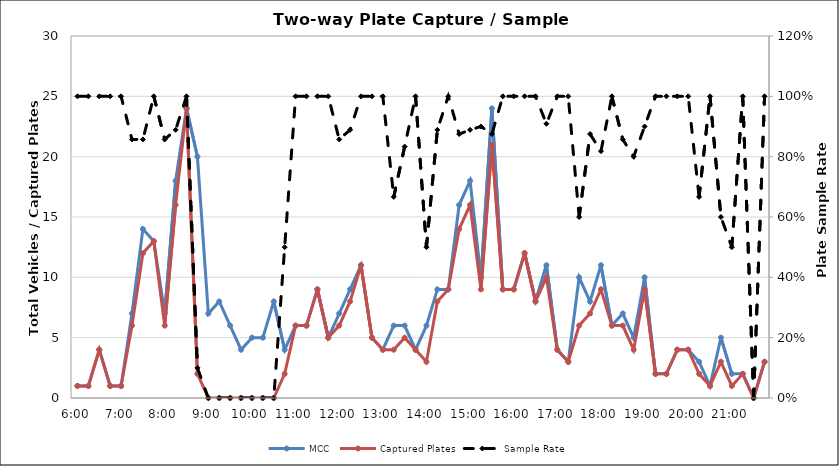
| Category | MCC | Captured Plates |
|---|---|---|
| 0.25 | 1 | 1 |
| 0.260416666666667 | 1 | 1 |
| 0.270833333333333 | 4 | 4 |
| 0.28125 | 1 | 1 |
| 0.291666666666667 | 1 | 1 |
| 0.302083333333333 | 7 | 6 |
| 0.3125 | 14 | 12 |
| 0.322916666666667 | 13 | 13 |
| 0.333333333333333 | 7 | 6 |
| 0.34375 | 18 | 16 |
| 0.354166666666667 | 24 | 24 |
| 0.364583333333333 | 20 | 2 |
| 0.375 | 7 | 0 |
| 0.385416666666667 | 8 | 0 |
| 0.395833333333333 | 6 | 0 |
| 0.40625 | 4 | 0 |
| 0.416666666666667 | 5 | 0 |
| 0.427083333333333 | 5 | 0 |
| 0.4375 | 8 | 0 |
| 0.447916666666667 | 4 | 2 |
| 0.458333333333333 | 6 | 6 |
| 0.46875 | 6 | 6 |
| 0.479166666666667 | 9 | 9 |
| 0.489583333333333 | 5 | 5 |
| 0.5 | 7 | 6 |
| 0.510416666666667 | 9 | 8 |
| 0.520833333333333 | 11 | 11 |
| 0.53125 | 5 | 5 |
| 0.541666666666667 | 4 | 4 |
| 0.552083333333333 | 6 | 4 |
| 0.5625 | 6 | 5 |
| 0.572916666666667 | 4 | 4 |
| 0.583333333333333 | 6 | 3 |
| 0.59375 | 9 | 8 |
| 0.604166666666667 | 9 | 9 |
| 0.614583333333333 | 16 | 14 |
| 0.625 | 18 | 16 |
| 0.635416666666667 | 10 | 9 |
| 0.645833333333333 | 24 | 21 |
| 0.65625 | 9 | 9 |
| 0.666666666666667 | 9 | 9 |
| 0.677083333333333 | 12 | 12 |
| 0.6875 | 8 | 8 |
| 0.697916666666667 | 11 | 10 |
| 0.708333333333333 | 4 | 4 |
| 0.71875 | 3 | 3 |
| 0.729166666666667 | 10 | 6 |
| 0.739583333333333 | 8 | 7 |
| 0.75 | 11 | 9 |
| 0.760416666666667 | 6 | 6 |
| 0.770833333333333 | 7 | 6 |
| 0.78125 | 5 | 4 |
| 0.791666666666667 | 10 | 9 |
| 0.802083333333333 | 2 | 2 |
| 0.8125 | 2 | 2 |
| 0.822916666666667 | 4 | 4 |
| 0.833333333333333 | 4 | 4 |
| 0.84375 | 3 | 2 |
| 0.854166666666667 | 1 | 1 |
| 0.864583333333333 | 5 | 3 |
| 0.875 | 2 | 1 |
| 0.885416666666667 | 2 | 2 |
| 0.895833333333333 | 0 | 0 |
| 0.90625 | 3 | 3 |